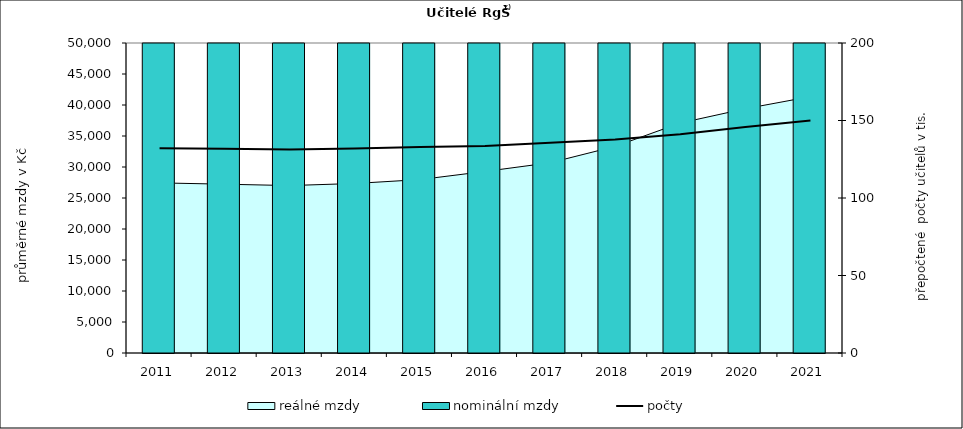
| Category | nominální mzdy |
|---|---|
| 2011.0 | 26011.553 |
| 2012.0 | 26654.329 |
| 2013.0 | 26815.833 |
| 2014.0 | 27261.213 |
| 2015.0 | 27969.265 |
| 2016.0 | 29487.404 |
| 2017.0 | 31631.64 |
| 2018.0 | 35088.9 |
| 2019.0 | 40172.121 |
| 2020.0 | 44060.072 |
| 2021.0 | 47589.507 |